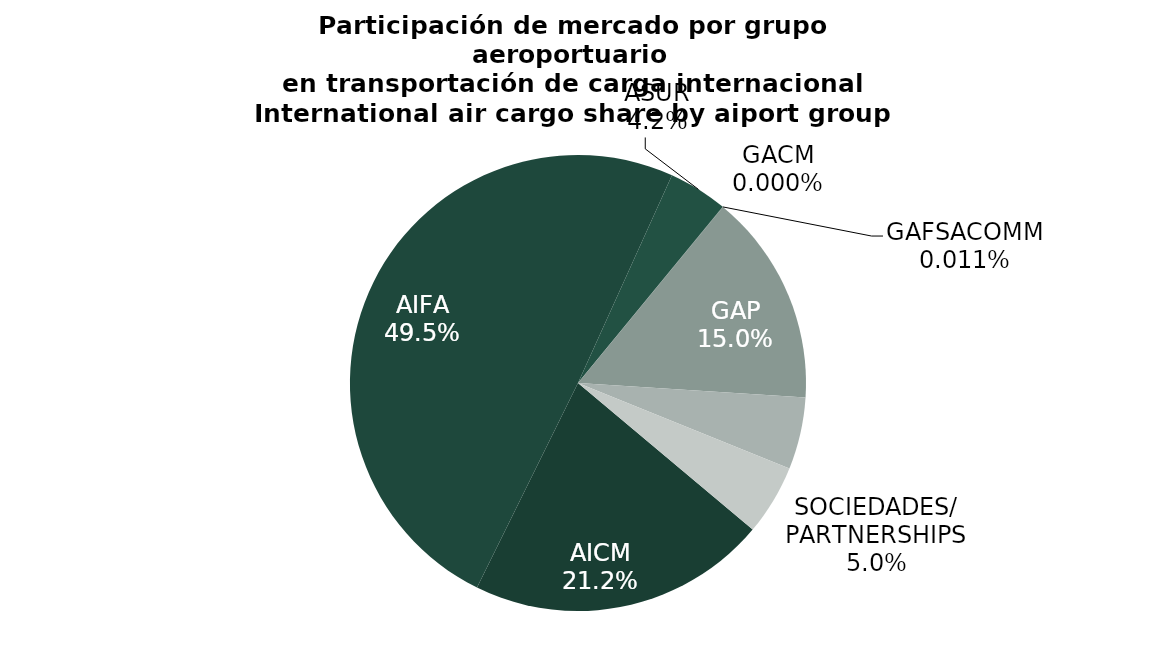
| Category | Series 0 |
|---|---|
| AICM | 15695.4 |
| AIFA | 36631.652 |
| ASUR | 3100.517 |
| GACM | 0 |
| GAFSACOMM | 8.5 |
| GAP | 11143.127 |
| OMA | 3778.649 |
| SOCIEDADES/
PARTNERSHIPS | 3704.538 |